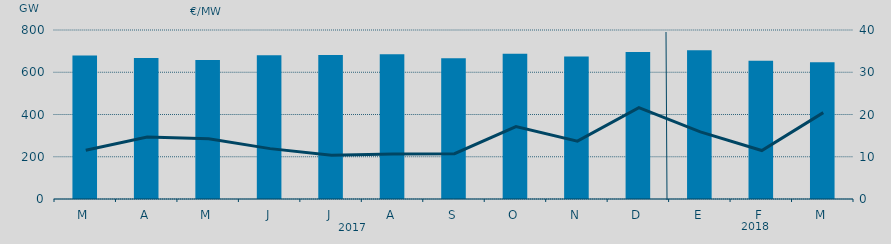
| Category | Energia (MWh) a subir |
|---|---|
| M | 679.79 |
| A | 667.793 |
| M | 657.634 |
| J | 680.754 |
| J | 681.722 |
| A | 685.083 |
| S | 666.501 |
| O | 686.996 |
| N | 674.335 |
| D | 695.754 |
| E | 703.828 |
| F | 654.951 |
| M | 647.688 |